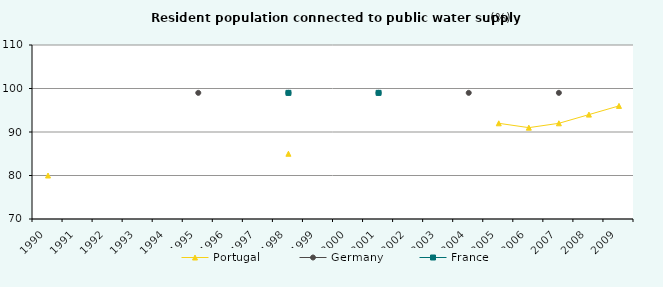
| Category | Portugal  | Germany | France |
|---|---|---|---|
| 1990.0 | 80 | 0 | 0 |
| 1991.0 | 0 | 0 | 0 |
| 1992.0 | 0 | 0 | 0 |
| 1993.0 | 0 | 0 | 0 |
| 1994.0 | 0 | 0 | 0 |
| 1995.0 | 0 | 99 | 0 |
| 1996.0 | 0 | 0 | 0 |
| 1997.0 | 0 | 0 | 0 |
| 1998.0 | 85 | 99 | 99 |
| 1999.0 | 0 | 0 | 0 |
| 2000.0 | 0 | 0 | 0 |
| 2001.0 | 0 | 99 | 99 |
| 2002.0 | 0 | 0 | 0 |
| 2003.0 | 0 | 0 | 0 |
| 2004.0 | 0 | 99 | 0 |
| 2005.0 | 92 | 0 | 0 |
| 2006.0 | 91 | 0 | 0 |
| 2007.0 | 92 | 99 | 0 |
| 2008.0 | 94 | 0 | 0 |
| 2009.0 | 96 | 0 | 0 |